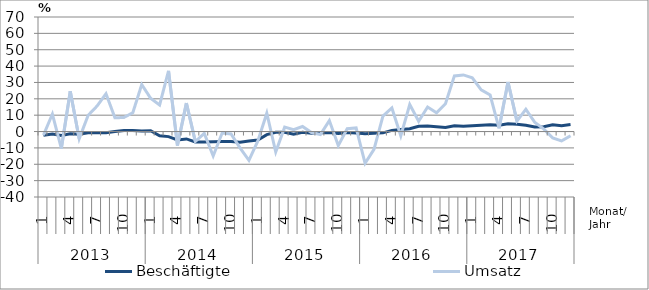
| Category | Beschäftigte | Umsatz |
|---|---|---|
| 0 | -2.3 | -2.2 |
| 1 | -1.5 | 10.7 |
| 2 | -2.4 | -10.3 |
| 3 | -1.3 | 24.6 |
| 4 | -1.6 | -4.4 |
| 5 | -0.7 | 9.9 |
| 6 | -0.8 | 15.6 |
| 7 | -0.8 | 23.1 |
| 8 | 0 | 8.4 |
| 9 | 0.7 | 8.6 |
| 10 | 0.6 | 11.5 |
| 11 | 0.3 | 28.7 |
| 12 | 0.5 | 20.3 |
| 13 | -2.6 | 16.2 |
| 14 | -3.1 | 37.1 |
| 15 | -5.1 | -8.5 |
| 16 | -4.5 | 17.4 |
| 17 | -6.4 | -6.1 |
| 18 | -6.4 | -1.1 |
| 19 | -6.2 | -14.9 |
| 20 | -6.1 | -0.9 |
| 21 | -6.1 | -1.5 |
| 22 | -6.6 | -10 |
| 23 | -5.8 | -17.6 |
| 24 | -5.2 | -5.7 |
| 25 | -1.9 | 11.2 |
| 26 | -0.5 | -12.5 |
| 27 | -0.5 | 2.7 |
| 28 | -1.7 | 1.2 |
| 29 | -0.5 | 3.1 |
| 30 | -1.1 | -0.6 |
| 31 | -0.8 | -1.8 |
| 32 | -0.6 | 6.7 |
| 33 | -1.2 | -8.6 |
| 34 | -0.6 | 1.7 |
| 35 | -0.9 | 2.2 |
| 36 | -1.3 | -19.4 |
| 37 | -1.1 | -10.9 |
| 38 | -0.8 | 9.4 |
| 39 | 0.7 | 14.4 |
| 40 | 1.2 | -2.6 |
| 41 | 1.7 | 16.5 |
| 42 | 3.2 | 6.3 |
| 43 | 3.4 | 15 |
| 44 | 3 | 11.5 |
| 45 | 2.5 | 17 |
| 46 | 3.6 | 34 |
| 47 | 3.2 | 34.6 |
| 48 | 3.5 | 32.8 |
| 49 | 3.8 | 25.5 |
| 50 | 4.2 | 22.3 |
| 51 | 3.9 | 2 |
| 52 | 4.7 | 30.3 |
| 53 | 4.4 | 6.4 |
| 54 | 3.9 | 13.6 |
| 55 | 2.8 | 5.6 |
| 56 | 3 | 1.6 |
| 57 | 4.2 | -3.9 |
| 58 | 3.6 | -5.7 |
| 59 | 4.3 | -2.6 |